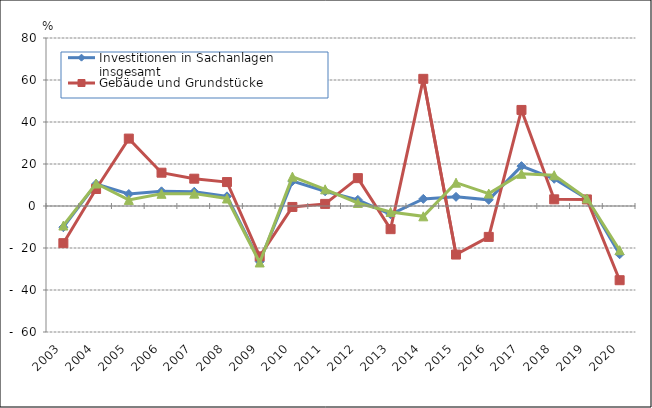
| Category | Investitionen in Sachanlagen insgesamt | Gebäude und Grundstücke | Maschinen und Betriebsausstattung |
|---|---|---|---|
| 2003.0 | -10.1 | -17.7 | -9.3 |
| 2004.0 | 10.5 | 8.1 | 10.7 |
| 2005.0 | 5.7 | 32.1 | 2.9 |
| 2006.0 | 6.991 | 15.857 | 5.812 |
| 2007.0 | 6.796 | 13.004 | 5.891 |
| 2008.0 | 4.6 | 11.4 | 3.579 |
| 2009.0 | -26.476 | -23.99 | -26.892 |
| 2010.0 | 11.843 | -0.455 | 13.982 |
| 2011.0 | 7.019 | 1.003 | 7.933 |
| 2012.0 | 2.918 | 13.273 | 1.446 |
| 2013.0 | -3.946 | -11.028 | -2.822 |
| 2014.0 | 3.39 | 60.554 | -4.916 |
| 2015.0 | 4.363 | -23.122 | 11.106 |
| 2016.0 | 2.923 | -14.713 | 5.917 |
| 2017.0 | 18.993 | 45.739 | 15.337 |
| 2018.0 | 12.959 | 3.178 | 14.649 |
| 2019.0 | 3.525 | 3.127 | 3.587 |
| 2020.0 | -22.979 | -35.342 | -21.066 |